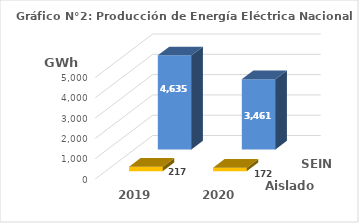
| Category | Aislados | SEIN |
|---|---|---|
| 2019.0 | 217.432 | 4635.039 |
| 2020.0 | 171.942 | 3461.214 |